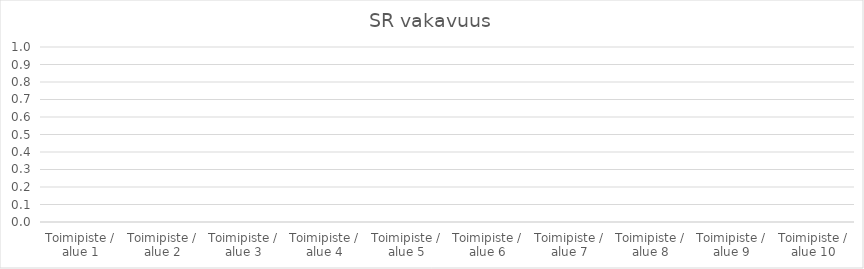
| Category | SR vakavuus |
|---|---|
| Toimipiste / alue 1 | 0 |
| Toimipiste / alue 2 | 0 |
| Toimipiste / alue 3 | 0 |
| Toimipiste / alue 4 | 0 |
| Toimipiste / alue 5 | 0 |
| Toimipiste / alue 6 | 0 |
| Toimipiste / alue 7 | 0 |
| Toimipiste / alue 8 | 0 |
| Toimipiste / alue 9 | 0 |
| Toimipiste / alue 10 | 0 |